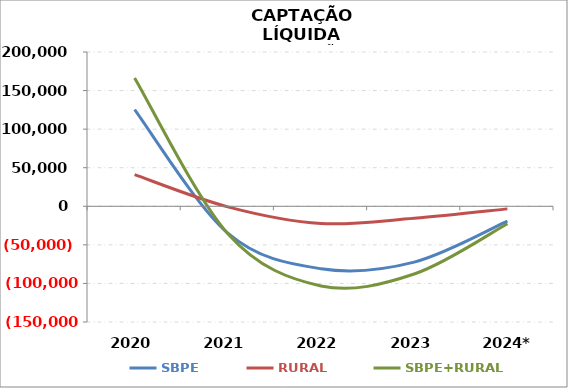
| Category | SBPE | RURAL | SBPE+RURAL |
|---|---|---|---|
| 2020 | 125352.739 | 40957.163 | 166309.902 |
| 2021 | -34755.497 | -741.413 | -35496.91 |
| 2022 | -80944.485 | -22292.691 | -103237.176 |
| 2023 | -72393.907 | -15425.218 | -87819.125 |
| 2024* | -19283.682 | -3349.744 | -22633.426 |